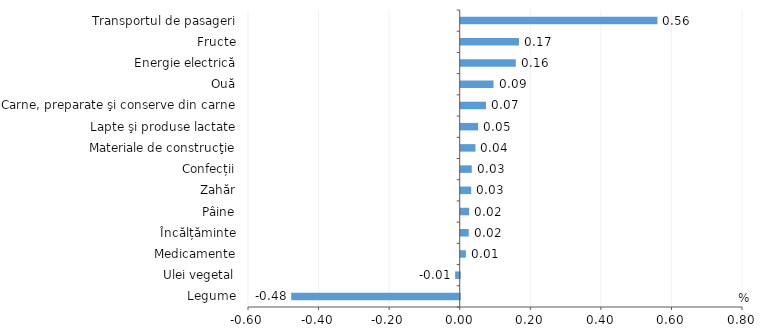
| Category | Series 0 |
|---|---|
| Legume | -0.477 |
| Ulei vegetal | -0.013 |
| Medicamente | 0.015 |
| Încălțăminte | 0.023 |
| Pâine | 0.024 |
| Zahăr | 0.03 |
| Confecții | 0.031 |
| Materiale de construcţie | 0.042 |
| Lapte şi produse lactate | 0.049 |
| Carne, preparate şi conserve din carne | 0.072 |
| Ouă | 0.093 |
|   Energie electrică | 0.156 |
| Fructe | 0.165 |
| Transportul de pasageri | 0.557 |